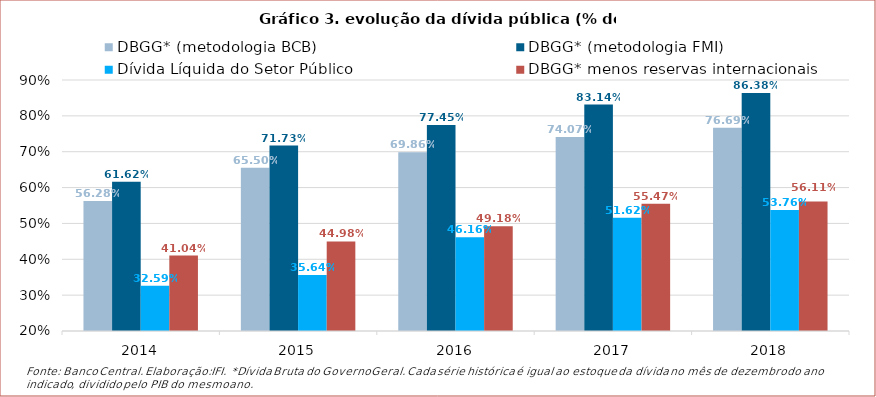
| Category | DBGG* (metodologia BCB) | DBGG* (metodologia FMI) | Dívida Líquida do Setor Público | DBGG* menos reservas internacionais |
|---|---|---|---|---|
| 2014.0 | 0.563 | 0.616 | 0.326 | 0.41 |
| 2015.0 | 0.655 | 0.717 | 0.356 | 0.45 |
| 2016.0 | 0.699 | 0.774 | 0.462 | 0.492 |
| 2017.0 | 0.741 | 0.831 | 0.516 | 0.555 |
| 2018.0 | 0.767 | 0.864 | 0.538 | 0.561 |